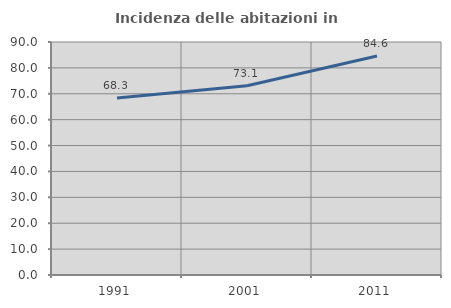
| Category | Incidenza delle abitazioni in proprietà  |
|---|---|
| 1991.0 | 68.345 |
| 2001.0 | 73.125 |
| 2011.0 | 84.571 |